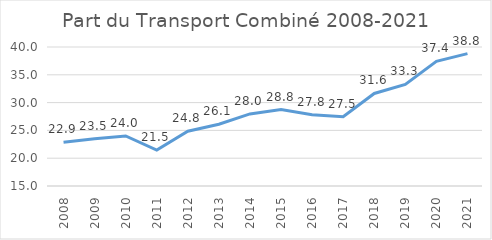
| Category | Part du transport combiné (%) |
|---|---|
| 2008.0 | 22.868 |
| 2009.0 | 23.485 |
| 2010.0 | 24 |
| 2011.0 | 21.469 |
| 2012.0 | 24.848 |
| 2013.0 | 26.112 |
| 2014.0 | 27.961 |
| 2015.0 | 28.758 |
| 2016.0 | 27.832 |
| 2017.0 | 27.454 |
| 2018.0 | 31.642 |
| 2019.0 | 33.267 |
| 2020.0 | 37.42 |
| 2021.0 | 38.801 |